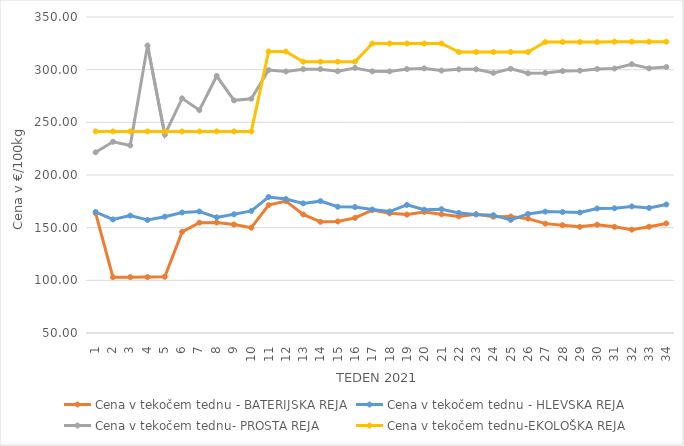
| Category | Cena v tekočem tednu - BATERIJSKA REJA | Cena v tekočem tednu - HLEVSKA REJA | Cena v tekočem tednu- PROSTA REJA | Cena v tekočem tednu-EKOLOŠKA REJA |
|---|---|---|---|---|
| 1.0 | 163.81 | 164.86 | 221.55 | 241.38 |
| 2.0 | 103.02 | 157.81 | 231.55 | 241.38 |
| 3.0 | 103.03 | 161.48 | 228.1 | 241.38 |
| 4.0 | 103.15 | 157.29 | 322.93 | 241.38 |
| 5.0 | 103.34 | 160.43 | 238.28 | 241.38 |
| 6.0 | 146.03 | 164.39 | 272.76 | 241.38 |
| 7.0 | 154.77 | 165.34 | 261.55 | 241.38 |
| 8.0 | 154.86 | 159.79 | 293.97 | 241.38 |
| 9.0 | 153 | 162.73 | 270.86 | 241.38 |
| 10.0 | 149.98 | 165.85 | 272.41 | 241.38 |
| 11.0 | 171.4 | 179.09 | 299.66 | 317.24 |
| 12.0 | 175.2 | 177.21 | 298.27 | 317.24 |
| 13.0 | 162.57 | 173.07 | 300.45 | 307.59 |
| 14.0 | 155.55 | 175.17 | 300.49 | 307.59 |
| 15.0 | 155.88 | 169.83 | 298.52 | 307.59 |
| 16.0 | 159.26 | 169.55 | 301.6 | 307.59 |
| 17.0 | 166.66 | 167.25 | 298.38 | 324.83 |
| 18.0 | 163.58 | 165.28 | 298.35 | 324.83 |
| 19.0 | 162.44 | 171.6 | 300.59 | 324.83 |
| 20.0 | 164.94 | 167.01 | 301.21 | 324.83 |
| 21.0 | 162.64 | 167.56 | 299.14 | 324.83 |
| 22.0 | 160.68 | 164.01 | 300.34 | 316.72 |
| 23.0 | 162.75 | 162.58 | 300.35 | 316.72 |
| 24.0 | 160.34 | 161.89 | 296.9 | 316.72 |
| 25.0 | 160.61 | 157.42 | 300.86 | 316.72 |
| 26.0 | 158.57 | 163.03 | 296.55 | 316.72 |
| 27.0 | 153.83 | 165.23 | 296.9 | 326.21 |
| 28.0 | 152.35 | 164.83 | 298.63 | 326.21 |
| 29.0 | 150.79 | 164.42 | 299.08 | 326.21 |
| 30.0 | 152.82 | 168.2 | 300.63 | 326.21 |
| 31.0 | 150.8 | 168.4 | 301.07 | 326.55 |
| 32.0 | 148.1 | 170.19 | 305.2 | 326.55 |
| 33.0 | 150.88 | 168.74 | 301.25 | 326.55 |
| 34.0 | 154.04 | 172.03 | 302.51 | 326.55 |